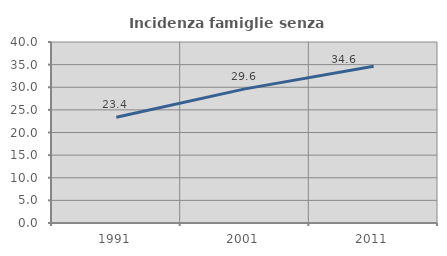
| Category | Incidenza famiglie senza nuclei |
|---|---|
| 1991.0 | 23.38 |
| 2001.0 | 29.646 |
| 2011.0 | 34.646 |